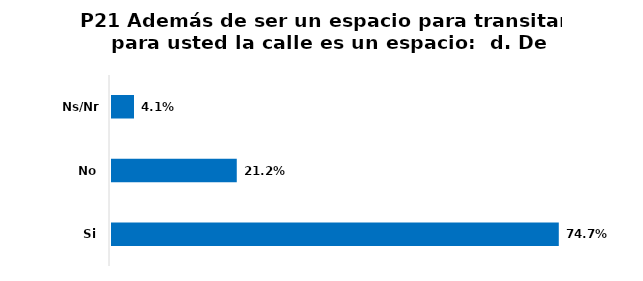
| Category | Series 0 |
|---|---|
| Si | 0.747 |
| No | 0.212 |
| Ns/Nr | 0.041 |